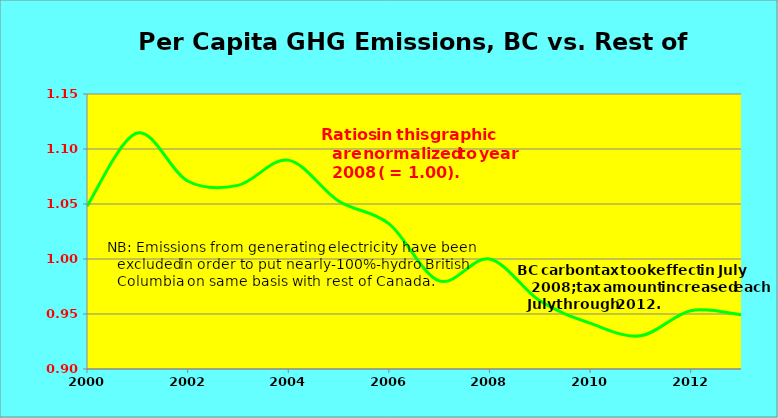
| Category | Series 1 |
|---|---|
| 2000.0 | 1.048 |
| 2001.0 | 1.115 |
| 2002.0 | 1.071 |
| 2003.0 | 1.067 |
| 2004.0 | 1.09 |
| 2005.0 | 1.053 |
| 2006.0 | 1.032 |
| 2007.0 | 0.98 |
| 2008.0 | 1 |
| 2009.0 | 0.962 |
| 2010.0 | 0.942 |
| 2011.0 | 0.93 |
| 2012.0 | 0.953 |
| 2013.0 | 0.949 |